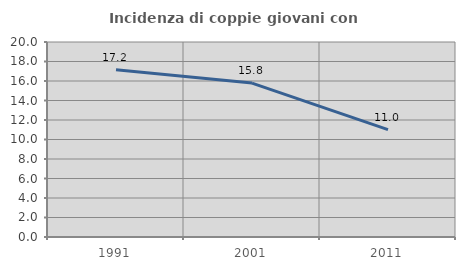
| Category | Incidenza di coppie giovani con figli |
|---|---|
| 1991.0 | 17.154 |
| 2001.0 | 15.784 |
| 2011.0 | 11.016 |